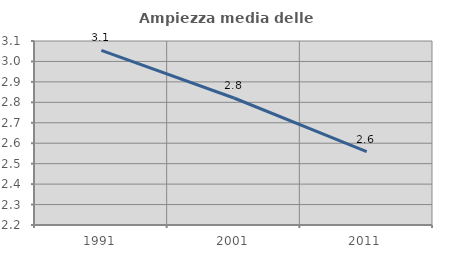
| Category | Ampiezza media delle famiglie |
|---|---|
| 1991.0 | 3.054 |
| 2001.0 | 2.821 |
| 2011.0 | 2.558 |